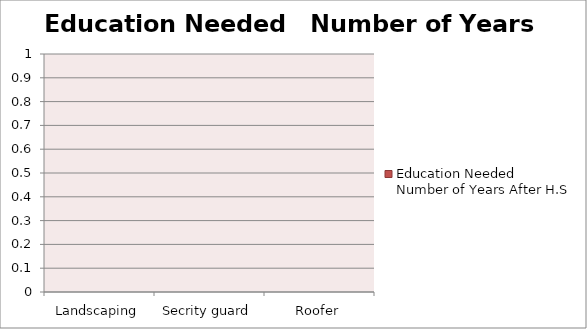
| Category | Education Needed  Number of Years After H.S |
|---|---|
| Landscaping | 0 |
| Secrity guard | 0 |
| Roofer | 0 |